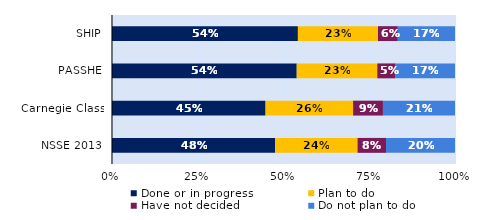
| Category | Done or in progress | Plan to do | Have not decided | Do not plan to do |
|---|---|---|---|---|
| SHIP | 0.542 | 0.234 | 0.058 | 0.167 |
| PASSHE | 0.539 | 0.235 | 0.053 | 0.173 |
| Carnegie Class | 0.448 | 0.255 | 0.087 | 0.21 |
| NSSE 2013 | 0.476 | 0.24 | 0.083 | 0.201 |